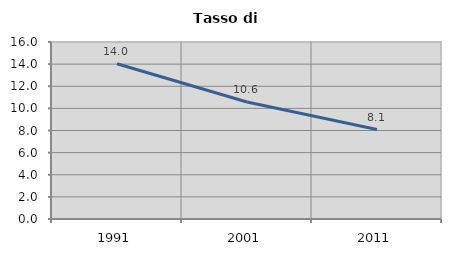
| Category | Tasso di disoccupazione   |
|---|---|
| 1991.0 | 14.035 |
| 2001.0 | 10.574 |
| 2011.0 | 8.084 |